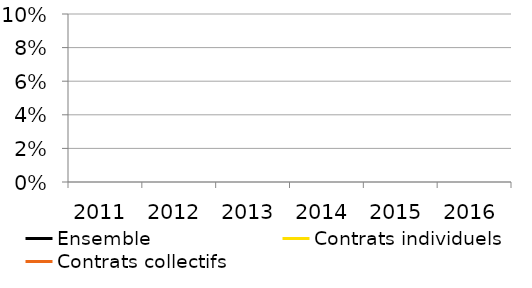
| Category | Ensemble | Contrats individuels | Contrats collectifs |
|---|---|---|---|
| 2011.0 | 0 | 0 | 0 |
| 2012.0 | 0 | 0 | 0 |
| 2013.0 | 0 | 0 | 0 |
| 2014.0 | 0 | 0 | 0 |
| 2015.0 | 0 | 0 | 0 |
| 2016.0 | 0 | 0 | 0 |